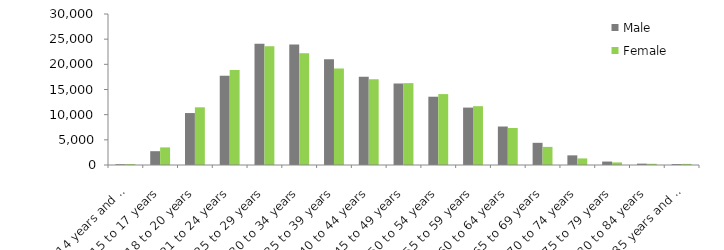
| Category | Male | Female |
|---|---|---|
| 14 years and under | 156 | 179 |
| 15 to 17 years | 2744 | 3497 |
| 18 to 20 years | 10323 | 11462 |
| 21 to 24 years | 17738 | 18860 |
| 25 to 29 years | 24114 | 23616 |
| 30 to 34 years | 23918 | 22219 |
| 35 to 39 years | 20995 | 19153 |
| 40 to 44 years | 17551 | 17042 |
| 45 to 49 years | 16192 | 16264 |
| 50 to 54 years | 13566 | 14085 |
| 55 to 59 years | 11407 | 11687 |
| 60 to 64 years | 7645 | 7356 |
| 65 to 69 years | 4407 | 3598 |
| 70 to 74 years | 1916 | 1305 |
| 75 to 79 years | 685 | 515 |
| 80 to 84 years | 271 | 238 |
| 85 years and over | 185 | 218 |